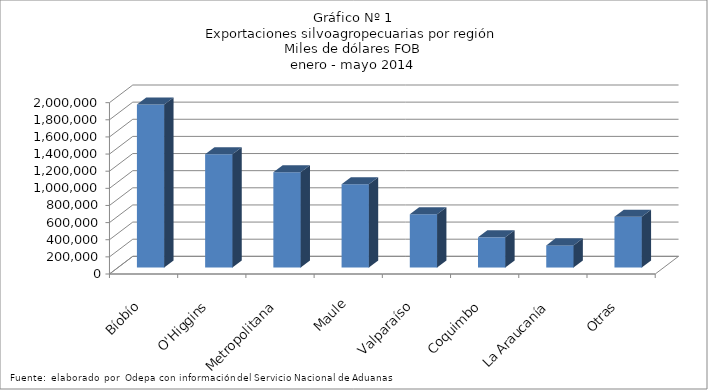
| Category | Series 0 |
|---|---|
| Bíobío | 1901766.03 |
| O'Higgins | 1322816.003 |
| Metropolitana | 1111007.795 |
| Maule | 971822.196 |
| Valparaíso | 622558.994 |
| Coquimbo | 352626.107 |
| La Araucanía | 258384.593 |
| Otras | 591550.776 |